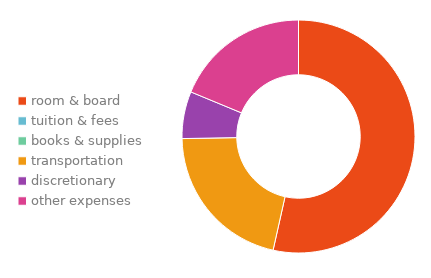
| Category | Series 0 |
|---|---|
| room & board | 0.535 |
| tuition & fees | 0 |
| books & supplies | 0 |
| transportation | 0.212 |
| discretionary | 0.065 |
| other expenses | 0.188 |